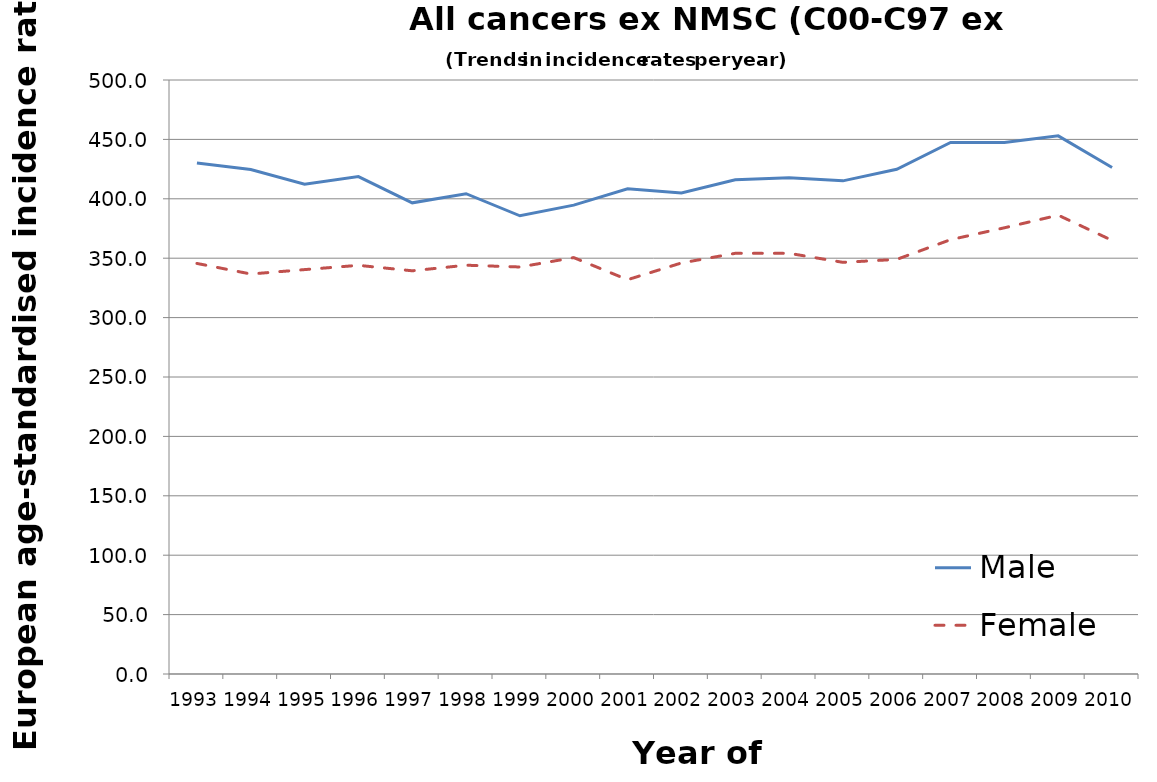
| Category | Male | Female |
|---|---|---|
| 1993.0 | 430.1 | 345.6 |
| 1994.0 | 424.6 | 336.7 |
| 1995.0 | 412.3 | 340.4 |
| 1996.0 | 418.7 | 344 |
| 1997.0 | 396.6 | 339.4 |
| 1998.0 | 404.3 | 344.1 |
| 1999.0 | 385.7 | 342.6 |
| 2000.0 | 394.7 | 350.5 |
| 2001.0 | 408.5 | 331.9 |
| 2002.0 | 404.9 | 346 |
| 2003.0 | 416 | 354.1 |
| 2004.0 | 417.8 | 354.1 |
| 2005.0 | 415.1 | 346.5 |
| 2006.0 | 424.9 | 349 |
| 2007.0 | 447.4 | 365.6 |
| 2008.0 | 447.4 | 375.6 |
| 2009.0 | 453 | 386.2 |
| 2010.0 | 426.3 | 365 |